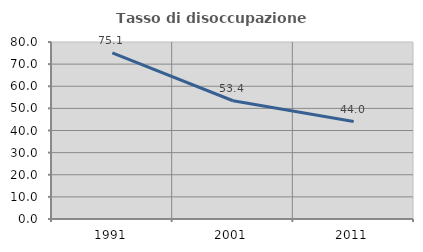
| Category | Tasso di disoccupazione giovanile  |
|---|---|
| 1991.0 | 75.096 |
| 2001.0 | 53.448 |
| 2011.0 | 44.03 |